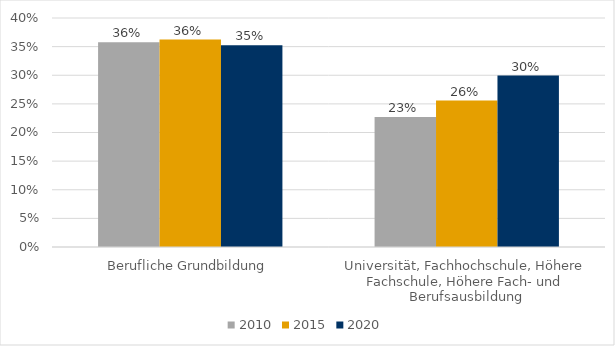
| Category | 2010 | 2015 | 2020 |
|---|---|---|---|
| Berufliche Grundbildung | 0.358 | 0.362 | 0.353 |
| Universität, Fachhochschule, Höhere Fachschule, Höhere Fach- und Berufsausbildung | 0.227 | 0.256 | 0.299 |